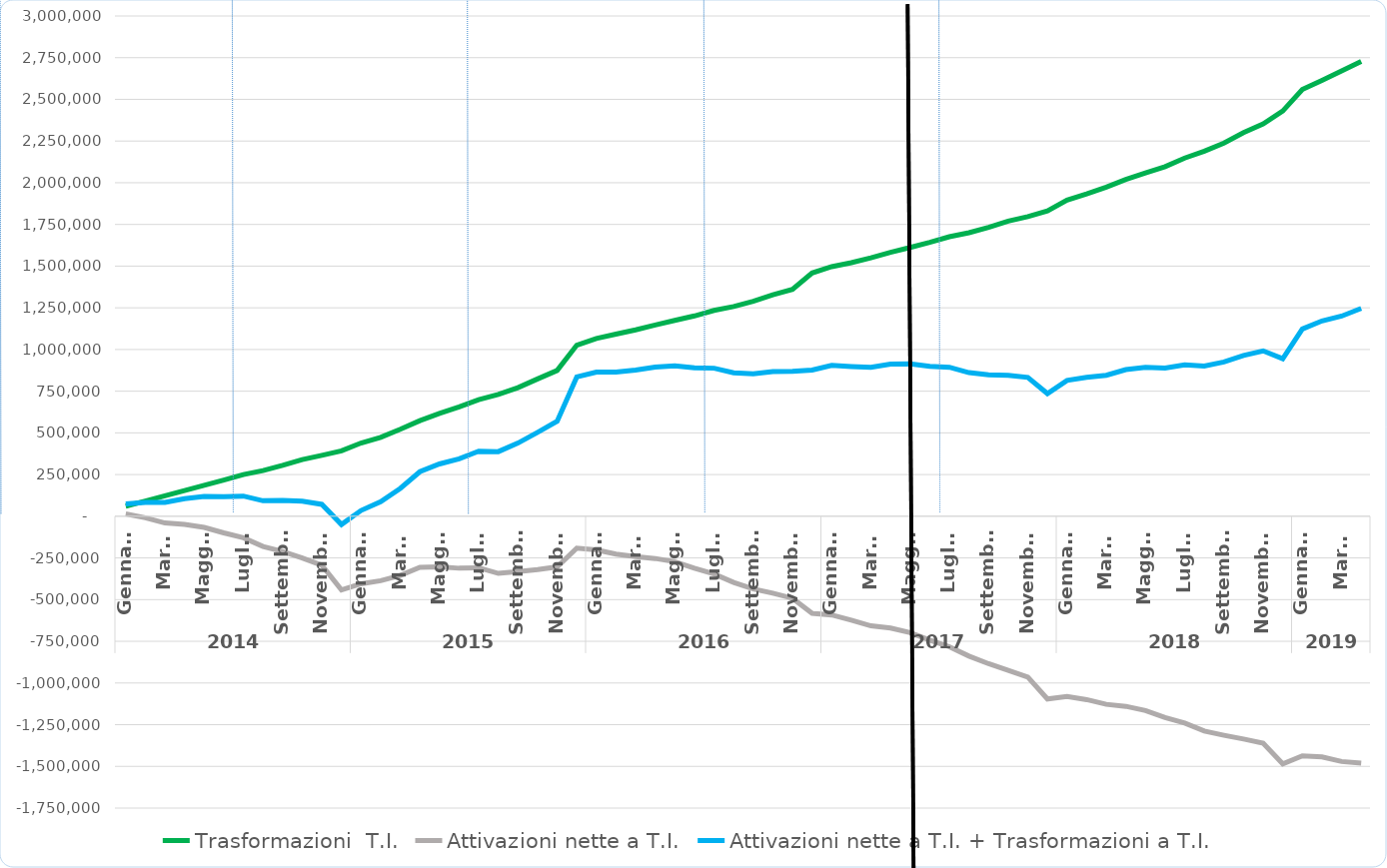
| Category | Trasformazioni  T.I. | Attivazioni nette a T.I. | Attivazioni nette a T.I. + Trasformazioni a T.I. |
|---|---|---|---|
| 0 | 60546 | 13801 | 74347 |
| 1 | 91176 | -8813 | 82363 |
| 2 | 123094 | -40319 | 82775 |
| 3 | 153792 | -48912 | 104880 |
| 4 | 185414 | -66843 | 118571 |
| 5 | 216809 | -99922 | 116887 |
| 6 | 249931 | -129141 | 120790 |
| 7 | 274054 | -181048 | 93006 |
| 8 | 305462 | -211279 | 94183 |
| 9 | 339997 | -250116 | 89881 |
| 10 | 365407 | -294219 | 71188 |
| 11 | 391822 | -441375 | -49553 |
| 12 | 439290 | -404704 | 34586 |
| 13 | 473272 | -386767 | 86505 |
| 14 | 521732 | -354841 | 166891 |
| 15 | 573433 | -306596 | 266837 |
| 16 | 617105 | -303418 | 313687 |
| 17 | 656017 | -311656 | 344361 |
| 18 | 698824 | -309094 | 389730 |
| 19 | 730336 | -342905 | 387431 |
| 20 | 771051 | -332244 | 438807 |
| 21 | 823232 | -320305 | 502927 |
| 22 | 874178 | -303932 | 570246 |
| 23 | 1026086 | -191048 | 835038 |
| 24 | 1066190 | -201639 | 864551 |
| 25 | 1091848 | -226584 | 865264 |
| 26 | 1117694 | -241472 | 876222 |
| 27 | 1147253 | -253348 | 893905 |
| 28 | 1174552 | -272692 | 901860 |
| 29 | 1201245 | -311543 | 889702 |
| 30 | 1234208 | -346391 | 887817 |
| 31 | 1257759 | -397219 | 860540 |
| 32 | 1289512 | -435629 | 853883 |
| 33 | 1328189 | -461147 | 867042 |
| 34 | 1360563 | -491822 | 868741 |
| 35 | 1458955 | -582213 | 876742 |
| 36 | 1496892 | -592034 | 904858 |
| 37 | 1520675 | -623040 | 897635 |
| 38 | 1550021 | -657157 | 892864 |
| 39 | 1583055 | -670411 | 912644 |
| 40 | 1611969 | -697554 | 914415 |
| 41 | 1642068 | -742657 | 899411 |
| 42 | 1676179 | -782667 | 893512 |
| 43 | 1700096 | -838715 | 861381 |
| 44 | 1732115 | -884245 | 847870 |
| 45 | 1769536 | -924016 | 845520 |
| 46 | 1796972 | -964653 | 832319 |
| 47 | 1831297 | -1095603 | 735694 |
| 48 | 1895717 | -1081462 | 814255 |
| 49 | 1933118 | -1099694 | 833424 |
| 50 | 1973403 | -1127822 | 845581 |
| 51 | 2019538 | -1139859 | 879679 |
| 52 | 2058496 | -1164843 | 893653 |
| 53 | 2096189 | -1207075 | 889114 |
| 54 | 2148057 | -1239901 | 908156 |
| 55 | 2189440 | -1288139 | 901301 |
| 56 | 2238051 | -1313280 | 924771 |
| 57 | 2300467 | -1335895 | 964572 |
| 58 | 2352911 | -1360971 | 991940 |
| 59 | 2429933 | -1484859 | 945074 |
| 60 | 2559436 | -1436601 | 1122835 |
| 61 | 2613963 | -1442687 | 1171276 |
| 62 | 2671055 | -1470780 | 1200275 |
| 63 | 2727163 | -1480861 | 1246302 |